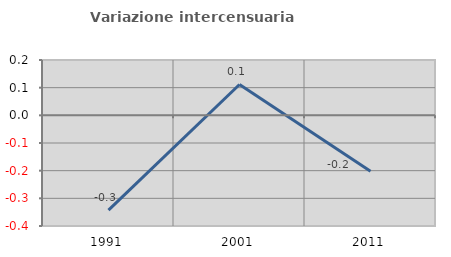
| Category | Variazione intercensuaria annua |
|---|---|
| 1991.0 | -0.342 |
| 2001.0 | 0.112 |
| 2011.0 | -0.202 |